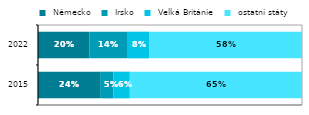
| Category |  Německo |  Irsko |  Velká Británie |  ostatní státy |
|---|---|---|---|---|
|  2015 | 0.235 | 0.051 | 0.062 | 0.652 |
| 2022 | 0.196 | 0.142 | 0.083 | 0.579 |